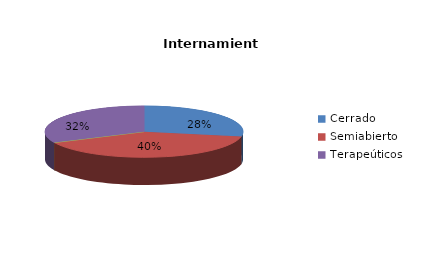
| Category | Series 0 |
|---|---|
| Cerrado | 7 |
| Semiabierto | 10 |
| Abierto | 0 |
| Terapeúticos | 8 |